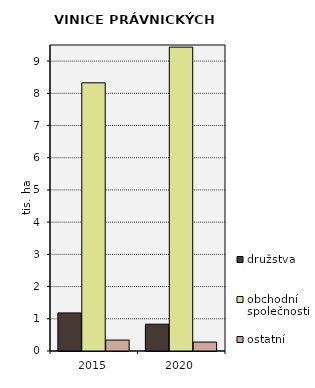
| Category | družstva | obchodní společnosti | ostatní |
|---|---|---|---|
| 2015.0 | 1182.609 | 8325.984 | 339.91 |
| 2020.0 | 832.114 | 9434.084 | 277.605 |